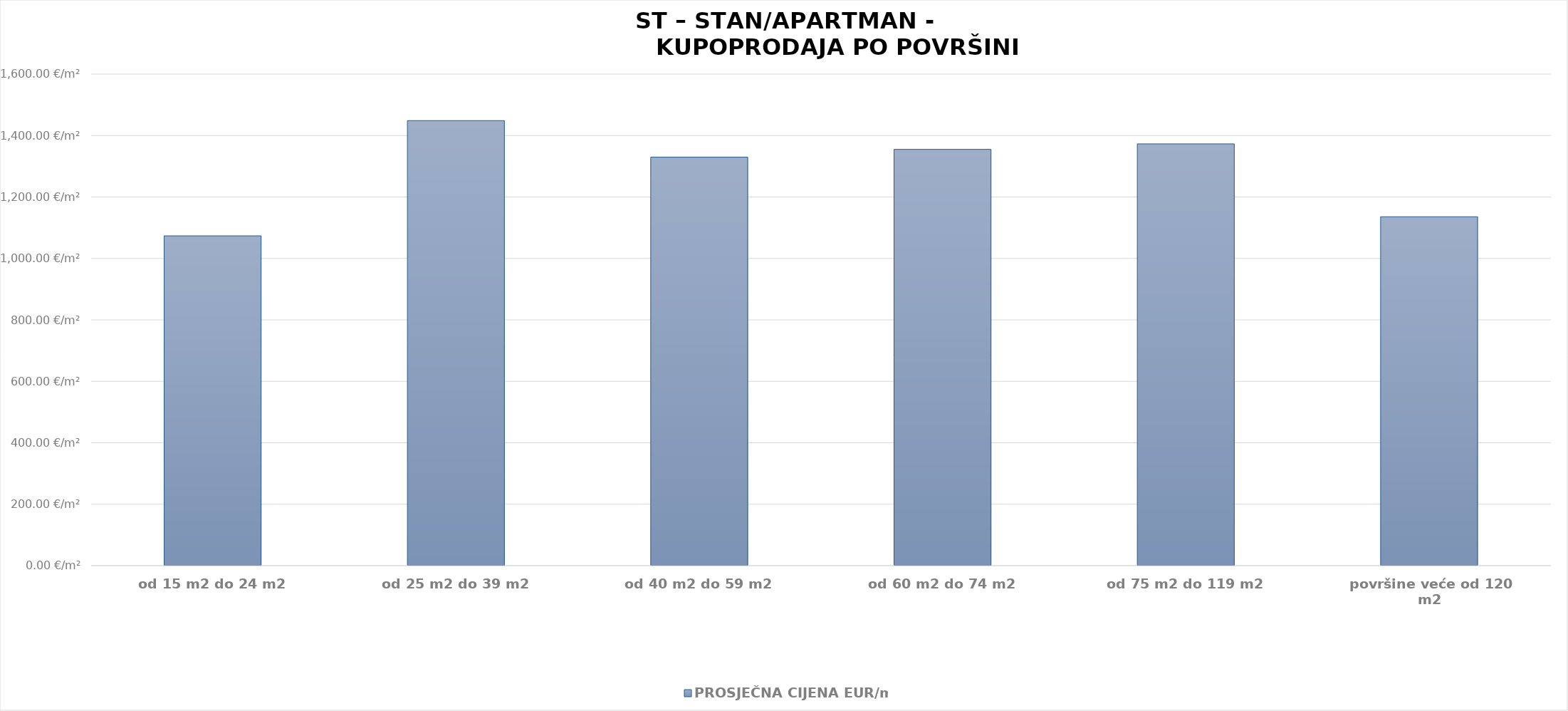
| Category | PROSJEČNA CIJENA EUR/m2 |
|---|---|
| od 15 m2 do 24 m2 | 1902-12-08 13:23:10 |
| od 25 m2 do 39 m2 | 1903-12-18 15:04:40 |
| od 40 m2 do 59 m2 | 1903-08-21 15:20:59 |
| od 60 m2 do 74 m2 | 1903-09-16 00:21:49 |
| od 75 m2 do 119 m2 | 1903-10-03 21:29:47 |
| površine veće od 120 m2 | 1903-02-08 16:39:24 |